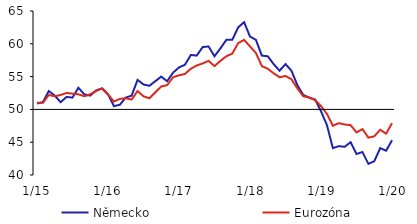
| Category | Německo | Eurozóna |
|---|---|---|
|  1/15 | 50.9 | 51 |
| 2 | 51.1 | 51 |
| 3 | 52.8 | 52.2 |
| 4 | 52.1 | 52 |
| 5 | 51.1 | 52.2 |
| 6 | 51.9 | 52.5 |
| 7 | 51.8 | 52.4 |
| 8 | 53.3 | 52.3 |
| 9 | 52.3 | 52 |
| 10 | 52.1 | 52.3 |
| 11 | 52.9 | 52.8 |
| 12 | 53.2 | 53.2 |
|  1/16 | 52.3 | 52.3 |
| 2 | 50.5 | 51.2 |
| 3 | 50.7 | 51.6 |
| 4 | 51.8 | 51.7 |
| 5 | 52.1 | 51.5 |
| 6 | 54.5 | 52.8 |
| 7 | 53.8 | 52 |
| 8 | 53.6 | 51.7 |
| 9 | 54.3 | 52.6 |
| 10 | 55 | 53.5 |
| 11 | 54.3 | 53.7 |
| 12 | 55.6 | 54.9 |
|  1/17 | 56.4 | 55.2 |
| 2 | 56.8 | 55.4 |
| 3 | 58.3 | 56.2 |
| 4 | 58.2 | 56.7 |
| 5 | 59.5 | 57 |
| 6 | 59.6 | 57.4 |
| 7 | 58.1 | 56.6 |
| 8 | 59.3 | 57.4 |
| 9 | 60.6 | 58.1 |
| 10 | 60.6 | 58.5 |
| 11 | 62.5 | 60.1 |
| 12 | 63.3 | 60.6 |
|  1/18 | 61.1 | 59.6 |
| 2 | 60.6 | 58.6 |
| 3 | 58.2 | 56.6 |
| 4 | 58.1 | 56.2 |
| 5 | 56.9 | 55.5 |
| 6 | 55.9 | 54.9 |
| 7 | 56.9 | 55.1 |
| 8 | 55.9 | 54.6 |
| 9 | 53.7 | 53.2 |
| 10 | 52.2 | 52 |
| 11 | 51.8 | 51.8 |
| 12 | 51.5 | 51.4 |
|  1/19 | 49.7 | 50.5 |
| 2 | 47.6 | 49.3 |
| 3 | 44.1 | 47.5 |
| 4 | 44.4 | 47.9 |
| 5 | 44.3 | 47.7 |
| 6 | 45 | 47.6 |
| 7 | 43.2 | 46.5 |
| 8 | 43.5 | 47 |
| 9 | 41.7 | 45.7 |
| 10 | 42.1 | 45.9 |
| 11 | 44.1 | 46.9 |
| 12 | 43.7 | 46.3 |
|  1/20 | 45.3 | 47.9 |